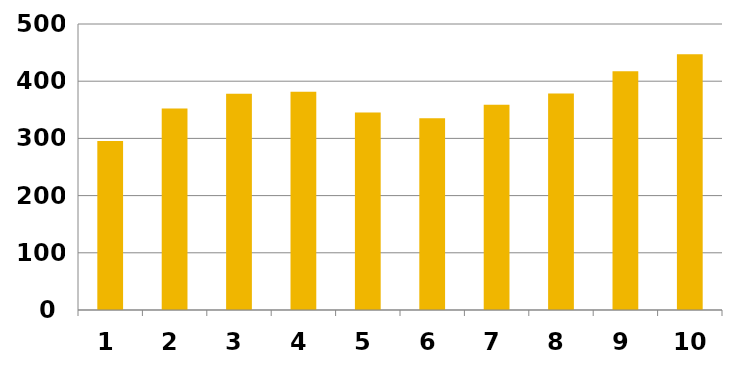
| Category | 2014 |
|---|---|
| 1.0 | 295.307 |
| 2.0 | 352.062 |
| 3.0 | 378.184 |
| 4.0 | 381.594 |
| 5.0 | 345.478 |
| 6.0 | 335.015 |
| 7.0 | 359.006 |
| 8.0 | 378.438 |
| 9.0 | 417.205 |
| 10.0 | 447.006 |